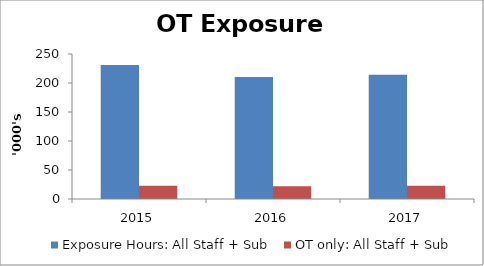
| Category | Exposure Hours: All Staff + Sub | OT only: All Staff + Sub |
|---|---|---|
| 2015.0 | 231066 | 23000 |
| 2016.0 | 210544 | 22000 |
| 2017.0 | 214425 | 23000 |